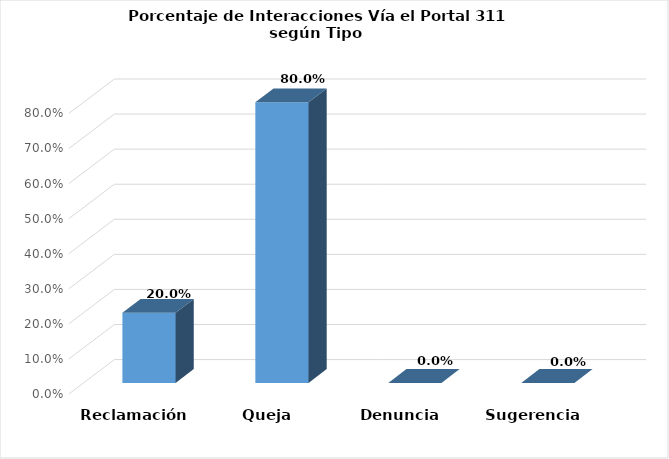
| Category | Series 0 |
|---|---|
| Reclamación | 0.2 |
| Queja | 0.8 |
| Denuncia | 0 |
| Sugerencia | 0 |